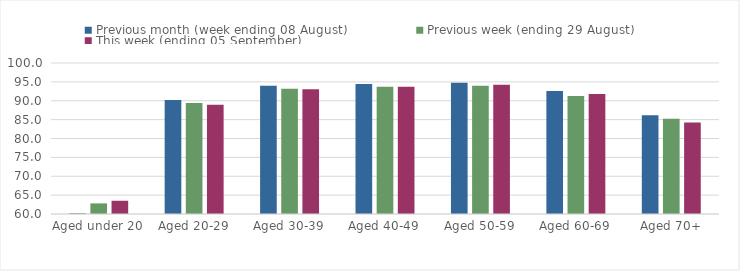
| Category | Previous month (week ending 08 August) | Previous week (ending 29 August) | This week (ending 05 September) |
|---|---|---|---|
| Aged under 20 | 60.17 | 62.81 | 63.51 |
| Aged 20-29 | 90.17 | 89.41 | 88.97 |
| Aged 30-39 | 93.96 | 93.17 | 93.05 |
| Aged 40-49 | 94.43 | 93.71 | 93.71 |
| Aged 50-59 | 94.78 | 93.96 | 94.26 |
| Aged 60-69 | 92.55 | 91.28 | 91.76 |
| Aged 70+ | 86.16 | 85.22 | 84.25 |